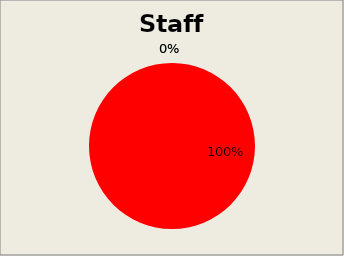
| Category | Series 3 |
|---|---|
| 0 | 0 |
| 1 | 13 |
| 2 | 0 |